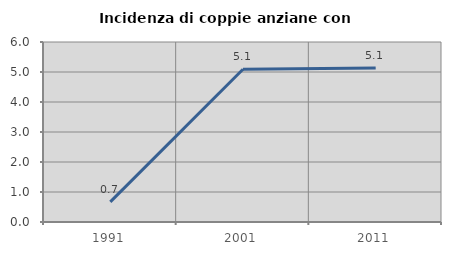
| Category | Incidenza di coppie anziane con figli |
|---|---|
| 1991.0 | 0.67 |
| 2001.0 | 5.093 |
| 2011.0 | 5.132 |